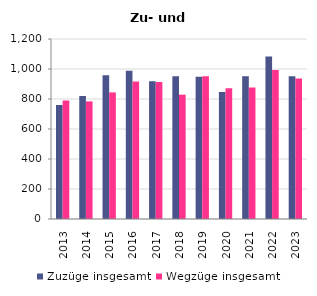
| Category | Zuzüge insgesamt | Wegzüge insgesamt |
|---|---|---|
| 2013.0 | 760 | 790 |
| 2014.0 | 820 | 784 |
| 2015.0 | 958 | 844 |
| 2016.0 | 988 | 916 |
| 2017.0 | 919 | 913 |
| 2018.0 | 952 | 829 |
| 2019.0 | 949 | 952 |
| 2020.0 | 847 | 871 |
| 2021.0 | 952 | 877 |
| 2022.0 | 1084 | 994 |
| 2023.0 | 952 | 937 |